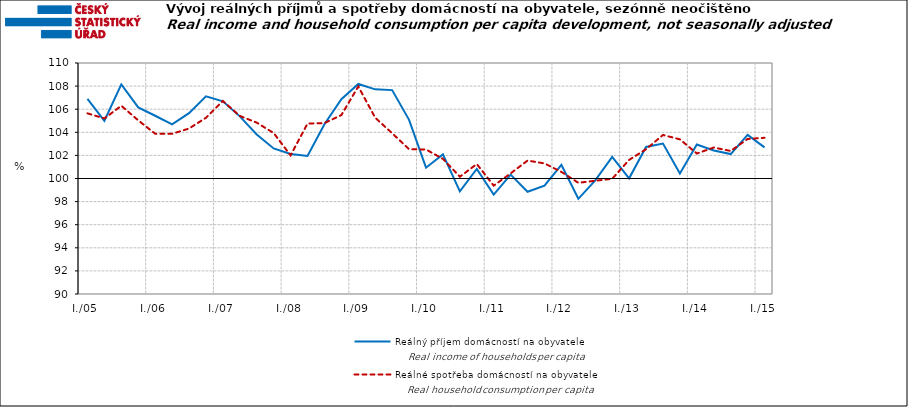
| Category | Reálný příjem domácností na obyvatele | Reálné spotřeba domácností na obyvatele |
|---|---|---|
| I./05 | 106.901 | 105.642 |
|  | 104.997 | 105.199 |
|  | 108.148 | 106.3 |
|  | 106.154 | 105.031 |
| I./06 | 105.434 | 103.879 |
|  | 104.689 | 103.87 |
|  | 105.658 | 104.326 |
|  | 107.116 | 105.256 |
| I./07 | 106.678 | 106.711 |
|  | 105.38 | 105.42 |
|  | 103.808 | 104.837 |
|  | 102.605 | 103.939 |
| I./08 | 102.123 | 102.003 |
|  | 101.954 | 104.757 |
|  | 104.699 | 104.794 |
|  | 106.864 | 105.492 |
| I./09 | 108.183 | 107.97 |
|  | 107.717 | 105.261 |
|  | 107.653 | 103.919 |
|  | 105.076 | 102.535 |
| I./10 | 100.936 | 102.513 |
|  | 102.09 | 101.699 |
|  | 98.881 | 100.155 |
|  | 100.828 | 101.253 |
| I./11 | 98.606 | 99.379 |
|  | 100.332 | 100.444 |
|  | 98.849 | 101.552 |
|  | 99.386 | 101.305 |
| I./12 | 101.189 | 100.571 |
|  | 98.242 | 99.628 |
|  | 99.844 | 99.805 |
|  | 101.878 | 99.972 |
| I./13 | 100.014 | 101.61 |
|  | 102.735 | 102.534 |
|  | 103.03 | 103.769 |
|  | 100.433 | 103.39 |
| I./14 | 102.938 | 102.164 |
|  | 102.425 | 102.681 |
|  | 102.116 | 102.384 |
|  | 103.781 | 103.423 |
| I./15 | 102.697 | 103.525 |